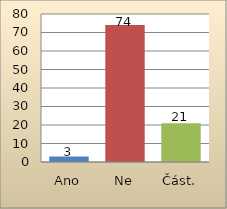
| Category | Series 0 |
|---|---|
| Ano | 3 |
| Ne | 74 |
| Část. | 21 |